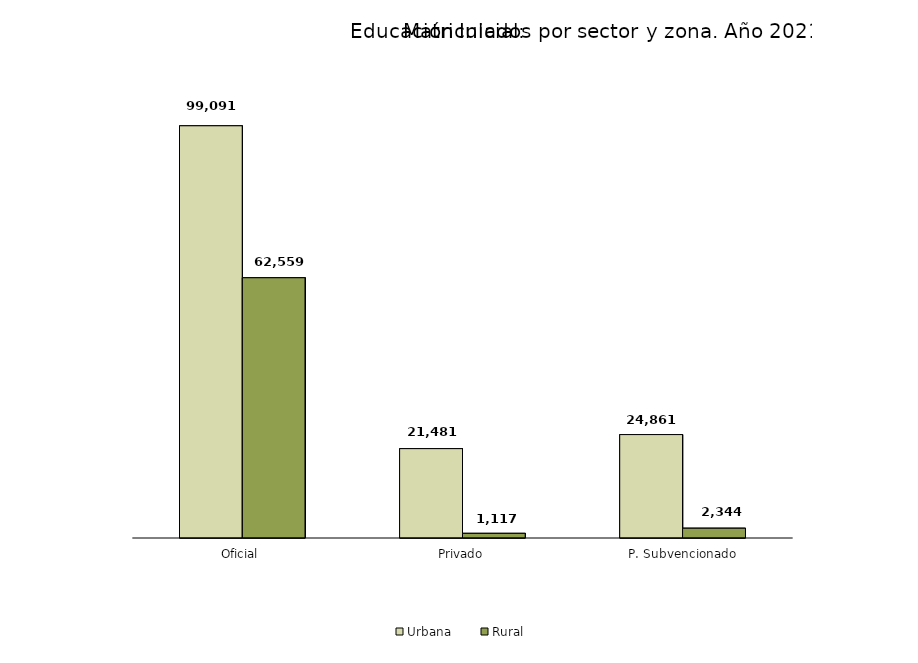
| Category | Urbana | Rural |
|---|---|---|
| Oficial | 99091 | 62559 |
| Privado | 21481 | 1117 |
| P. Subvencionado | 24861 | 2344 |